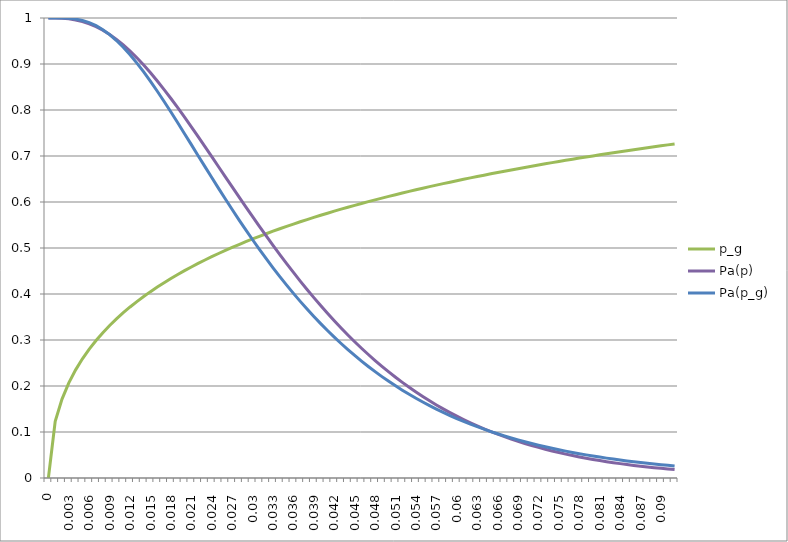
| Category | p_g | Pa(p) | Pa(p_g) |
|---|---|---|---|
| 0.0 | 0 | 1 | 1 |
| 0.001 | 0.123 | 1 | 1 |
| 0.002 | 0.172 | 0.999 | 1 |
| 0.003 | 0.207 | 0.998 | 0.999 |
| 0.004 | 0.235 | 0.996 | 0.998 |
| 0.005 | 0.259 | 0.992 | 0.995 |
| 0.006 | 0.28 | 0.987 | 0.99 |
| 0.007 | 0.299 | 0.981 | 0.983 |
| 0.008 | 0.316 | 0.973 | 0.975 |
| 0.009000000000000001 | 0.332 | 0.964 | 0.964 |
| 0.010000000000000002 | 0.346 | 0.953 | 0.951 |
| 0.011000000000000003 | 0.359 | 0.941 | 0.936 |
| 0.012000000000000004 | 0.372 | 0.928 | 0.92 |
| 0.013000000000000005 | 0.384 | 0.913 | 0.902 |
| 0.014000000000000005 | 0.395 | 0.898 | 0.883 |
| 0.015000000000000006 | 0.405 | 0.881 | 0.862 |
| 0.016000000000000007 | 0.415 | 0.863 | 0.841 |
| 0.017000000000000008 | 0.425 | 0.844 | 0.818 |
| 0.01800000000000001 | 0.434 | 0.825 | 0.796 |
| 0.01900000000000001 | 0.442 | 0.805 | 0.772 |
| 0.02000000000000001 | 0.451 | 0.784 | 0.749 |
| 0.02100000000000001 | 0.459 | 0.763 | 0.725 |
| 0.022000000000000013 | 0.466 | 0.742 | 0.701 |
| 0.023000000000000013 | 0.474 | 0.72 | 0.677 |
| 0.024000000000000014 | 0.481 | 0.699 | 0.653 |
| 0.025000000000000015 | 0.488 | 0.677 | 0.63 |
| 0.026000000000000016 | 0.495 | 0.655 | 0.606 |
| 0.027000000000000017 | 0.501 | 0.633 | 0.584 |
| 0.028000000000000018 | 0.508 | 0.611 | 0.561 |
| 0.02900000000000002 | 0.514 | 0.59 | 0.539 |
| 0.03000000000000002 | 0.52 | 0.568 | 0.518 |
| 0.03100000000000002 | 0.525 | 0.547 | 0.497 |
| 0.03200000000000002 | 0.531 | 0.526 | 0.477 |
| 0.03300000000000002 | 0.536 | 0.506 | 0.457 |
| 0.03400000000000002 | 0.542 | 0.486 | 0.438 |
| 0.035000000000000024 | 0.547 | 0.466 | 0.419 |
| 0.036000000000000025 | 0.552 | 0.447 | 0.401 |
| 0.037000000000000026 | 0.557 | 0.428 | 0.384 |
| 0.03800000000000003 | 0.562 | 0.41 | 0.367 |
| 0.03900000000000003 | 0.567 | 0.392 | 0.351 |
| 0.04000000000000003 | 0.571 | 0.375 | 0.336 |
| 0.04100000000000003 | 0.576 | 0.358 | 0.321 |
| 0.04200000000000003 | 0.58 | 0.342 | 0.306 |
| 0.04300000000000003 | 0.584 | 0.326 | 0.292 |
| 0.04400000000000003 | 0.589 | 0.311 | 0.279 |
| 0.04500000000000003 | 0.593 | 0.296 | 0.266 |
| 0.046000000000000034 | 0.597 | 0.282 | 0.254 |
| 0.047000000000000035 | 0.601 | 0.268 | 0.242 |
| 0.048000000000000036 | 0.605 | 0.255 | 0.231 |
| 0.04900000000000004 | 0.608 | 0.243 | 0.22 |
| 0.05000000000000004 | 0.612 | 0.231 | 0.21 |
| 0.05100000000000004 | 0.616 | 0.219 | 0.2 |
| 0.05200000000000004 | 0.62 | 0.208 | 0.191 |
| 0.05300000000000004 | 0.623 | 0.197 | 0.182 |
| 0.05400000000000004 | 0.627 | 0.187 | 0.173 |
| 0.05500000000000004 | 0.63 | 0.177 | 0.165 |
| 0.05600000000000004 | 0.633 | 0.168 | 0.157 |
| 0.057000000000000044 | 0.637 | 0.159 | 0.15 |
| 0.058000000000000045 | 0.64 | 0.15 | 0.143 |
| 0.059000000000000045 | 0.643 | 0.142 | 0.136 |
| 0.060000000000000046 | 0.646 | 0.134 | 0.129 |
| 0.06100000000000005 | 0.649 | 0.127 | 0.123 |
| 0.06200000000000005 | 0.652 | 0.12 | 0.117 |
| 0.06300000000000004 | 0.655 | 0.113 | 0.111 |
| 0.06400000000000004 | 0.658 | 0.107 | 0.106 |
| 0.06500000000000004 | 0.661 | 0.101 | 0.101 |
| 0.06600000000000004 | 0.664 | 0.095 | 0.096 |
| 0.06700000000000005 | 0.667 | 0.09 | 0.091 |
| 0.06800000000000005 | 0.67 | 0.085 | 0.087 |
| 0.06900000000000005 | 0.672 | 0.08 | 0.083 |
| 0.07000000000000005 | 0.675 | 0.075 | 0.079 |
| 0.07100000000000005 | 0.678 | 0.071 | 0.075 |
| 0.07200000000000005 | 0.68 | 0.066 | 0.071 |
| 0.07300000000000005 | 0.683 | 0.063 | 0.068 |
| 0.07400000000000005 | 0.686 | 0.059 | 0.065 |
| 0.07500000000000005 | 0.688 | 0.055 | 0.061 |
| 0.07600000000000005 | 0.691 | 0.052 | 0.058 |
| 0.07700000000000005 | 0.693 | 0.049 | 0.056 |
| 0.07800000000000006 | 0.695 | 0.046 | 0.053 |
| 0.07900000000000006 | 0.698 | 0.043 | 0.05 |
| 0.08000000000000006 | 0.7 | 0.04 | 0.048 |
| 0.08100000000000006 | 0.703 | 0.038 | 0.045 |
| 0.08200000000000006 | 0.705 | 0.036 | 0.043 |
| 0.08300000000000006 | 0.707 | 0.033 | 0.041 |
| 0.08400000000000006 | 0.709 | 0.031 | 0.039 |
| 0.08500000000000006 | 0.712 | 0.029 | 0.037 |
| 0.08600000000000006 | 0.714 | 0.027 | 0.035 |
| 0.08700000000000006 | 0.716 | 0.026 | 0.034 |
| 0.08800000000000006 | 0.718 | 0.024 | 0.032 |
| 0.08900000000000007 | 0.72 | 0.023 | 0.03 |
| 0.09000000000000007 | 0.722 | 0.021 | 0.029 |
| 0.09100000000000007 | 0.724 | 0.02 | 0.028 |
| 0.09200000000000007 | 0.726 | 0.018 | 0.026 |